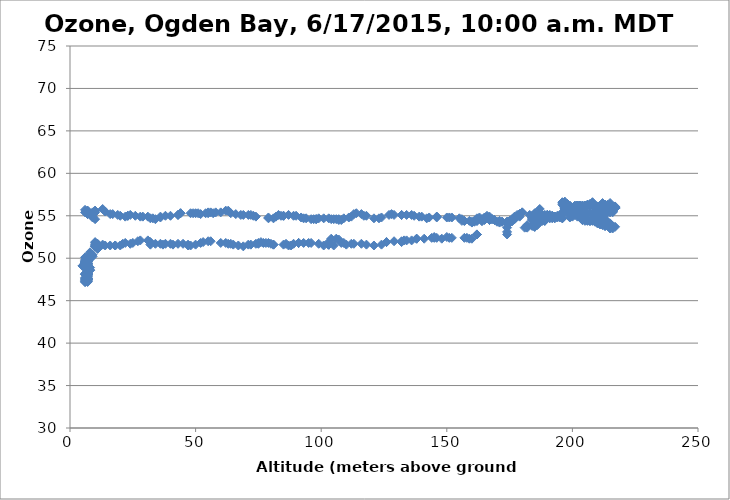
| Category | Series 0 |
|---|---|
| 6.0 | 50.1 |
| -2.0 | 50 |
| 6.0 | 49.8 |
| 6.0 | 49.5 |
| 6.0 | 49.5 |
| 6.0 | 49.3 |
| 6.0 | 49.3 |
| 6.0 | 49.3 |
| 6.0 | 49.1 |
| 6.0 | 49.1 |
| 6.0 | 49 |
| 6.0 | 49 |
| 6.0 | 49 |
| 6.0 | 49 |
| 6.0 | 49.1 |
| 6.0 | 49.1 |
| 6.0 | 49.1 |
| 6.0 | 49.2 |
| 6.0 | 49.3 |
| 6.0 | 49.4 |
| 6.0 | 49.4 |
| 6.0 | 49.4 |
| 6.0 | 49.5 |
| 6.0 | 49.6 |
| 6.0 | 49.5 |
| 6.0 | 49.5 |
| 6.0 | 49.4 |
| 6.0 | 49.2 |
| 6.0 | 49.2 |
| 6.0 | 49.2 |
| 6.0 | 49.3 |
| 6.0 | 49.3 |
| 6.0 | 49.4 |
| 6.0 | 49.4 |
| 6.0 | 49.4 |
| 6.0 | 49.4 |
| 6.0 | 49.5 |
| 6.0 | 49.6 |
| 6.0 | 49.7 |
| 7.0 | 49.7 |
| 7.0 | 49.7 |
| 7.0 | 49.8 |
| 7.0 | 49.8 |
| 7.0 | 49.6 |
| 7.0 | 49.4 |
| 7.0 | 49.2 |
| 7.0 | 49.2 |
| 7.0 | 49.3 |
| 7.0 | 49.4 |
| 7.0 | 49.4 |
| 7.0 | 49.4 |
| 7.0 | 49.4 |
| 7.0 | 49.4 |
| 7.0 | 49.3 |
| 7.0 | 49.2 |
| 7.0 | 49.1 |
| 7.0 | 49 |
| 7.0 | 49 |
| 7.0 | 48.9 |
| 7.0 | 48.9 |
| 7.0 | 48.6 |
| 7.0 | 48.5 |
| 7.0 | 48.4 |
| 7.0 | 48.2 |
| 7.0 | 48 |
| 7.0 | 47.8 |
| 7.0 | 47.6 |
| 7.0 | 47.6 |
| 7.0 | 47.6 |
| 7.0 | 47.5 |
| 7.0 | 47.5 |
| 7.0 | 47.5 |
| 7.0 | 47.5 |
| 7.0 | 47.5 |
| 7.0 | 47.6 |
| 7.0 | 47.6 |
| 7.0 | 47.6 |
| 7.0 | 47.6 |
| 7.0 | 47.5 |
| 7.0 | 47.4 |
| 7.0 | 47.3 |
| 7.0 | 47.3 |
| 7.0 | 47.4 |
| 7.0 | 47.3 |
| 7.0 | 47.3 |
| 7.0 | 47.2 |
| 6.0 | 47.2 |
| 6.0 | 47.2 |
| 6.0 | 47.3 |
| 6.0 | 47.4 |
| 6.0 | 47.5 |
| 6.0 | 47.6 |
| 6.0 | 47.7 |
| 7.0 | 47.9 |
| 7.0 | 48.1 |
| 7.0 | 48.1 |
| 7.0 | 48.2 |
| 7.0 | 48.2 |
| 7.0 | 48.1 |
| 6.0 | 48.1 |
| 6.0 | 48.2 |
| 6.0 | 48.1 |
| 7.0 | 47.8 |
| 7.0 | 47.8 |
| 7.0 | 47.7 |
| 7.0 | 47.6 |
| 7.0 | 47.9 |
| 7.0 | 48.1 |
| 7.0 | 48.1 |
| 7.0 | 48.2 |
| 7.0 | 48.5 |
| 7.0 | 48.7 |
| 7.0 | 48.8 |
| 7.0 | 48.8 |
| 7.0 | 48.9 |
| 7.0 | 49.1 |
| 7.0 | 48.9 |
| 7.0 | 48.7 |
| 7.0 | 48.8 |
| 7.0 | 49.6 |
| 7.0 | 49.3 |
| 7.0 | 49.1 |
| 7.0 | 49.5 |
| 7.0 | 49.6 |
| 7.0 | 49.6 |
| 7.0 | 49.6 |
| 7.0 | 49.3 |
| 8.0 | 48.9 |
| 8.0 | 48.6 |
| 8.0 | 48.6 |
| 7.0 | 48.6 |
| 7.0 | 48.2 |
| 7.0 | 48.1 |
| 7.0 | 48 |
| 7.0 | 48 |
| 7.0 | 48.2 |
| 7.0 | 48.3 |
| 7.0 | 48.5 |
| 7.0 | 48.6 |
| 7.0 | 48.7 |
| 7.0 | 49.1 |
| 6.0 | 49.2 |
| 6.0 | 49.2 |
| 5.0 | 49.1 |
| 5.0 | 49.1 |
| 6.0 | 49.2 |
| 6.0 | 49.3 |
| 7.0 | 49.6 |
| 7.0 | 49.6 |
| 7.0 | 49.7 |
| 8.0 | 50 |
| 8.0 | 50.5 |
| 8.0 | 50.7 |
| 9.0 | 50.2 |
| 9.0 | 50.4 |
| 11.0 | 51.1 |
| 11.0 | 51.2 |
| 11.0 | 51.3 |
| 11.0 | 51.5 |
| 11.0 | 51.5 |
| 11.0 | 51.6 |
| 10.0 | 51.4 |
| 10.0 | 51.5 |
| 10.0 | 51.4 |
| 10.0 | 51.4 |
| 10.0 | 51.8 |
| 10.0 | 51.9 |
| 10.0 | 51.6 |
| 11.0 | 51.6 |
| 11.0 | 51.7 |
| 13.0 | 51.6 |
| 14.0 | 51.5 |
| 16.0 | 51.5 |
| 18.0 | 51.5 |
| 18.0 | 51.5 |
| 20.0 | 51.5 |
| 21.0 | 51.7 |
| 22.0 | 51.8 |
| 24.0 | 51.7 |
| 25.0 | 51.8 |
| 27.0 | 52 |
| 28.0 | 52.1 |
| 31.0 | 52.1 |
| 32.0 | 51.9 |
| 32.0 | 51.6 |
| 34.0 | 51.7 |
| 36.0 | 51.7 |
| 37.0 | 51.6 |
| 38.0 | 51.7 |
| 40.0 | 51.7 |
| 41.0 | 51.6 |
| 43.0 | 51.7 |
| 45.0 | 51.7 |
| 47.0 | 51.6 |
| 47.0 | 51.5 |
| 48.0 | 51.5 |
| 50.0 | 51.6 |
| 52.0 | 51.8 |
| 53.0 | 51.9 |
| 55.0 | 52 |
| 56.0 | 52 |
| 60.0 | 51.8 |
| 62.0 | 51.8 |
| 63.0 | 51.7 |
| 64.0 | 51.7 |
| 65.0 | 51.6 |
| 67.0 | 51.5 |
| 69.0 | 51.4 |
| 71.0 | 51.6 |
| 72.0 | 51.6 |
| 74.0 | 51.7 |
| 75.0 | 51.7 |
| 75.0 | 51.8 |
| 76.0 | 51.9 |
| 77.0 | 51.8 |
| 78.0 | 51.8 |
| 79.0 | 51.8 |
| 80.0 | 51.7 |
| 81.0 | 51.6 |
| 81.0 | 51.6 |
| 85.0 | 51.6 |
| 86.0 | 51.7 |
| 87.0 | 51.5 |
| 88.0 | 51.5 |
| 89.0 | 51.7 |
| 91.0 | 51.8 |
| 91.0 | 51.8 |
| 91.0 | 51.8 |
| 93.0 | 51.8 |
| 95.0 | 51.8 |
| 96.0 | 51.8 |
| 99.0 | 51.7 |
| 101.0 | 51.5 |
| 103.0 | 51.6 |
| 103.0 | 51.6 |
| 103.0 | 51.6 |
| 103.0 | 51.6 |
| 103.0 | 51.6 |
| 103.0 | 51.9 |
| 104.0 | 52.3 |
| 105.0 | 51.5 |
| 106.0 | 52.3 |
| 107.0 | 52.2 |
| 108.0 | 51.8 |
| 109.0 | 51.8 |
| 110.0 | 51.6 |
| 112.0 | 51.7 |
| 113.0 | 51.7 |
| 116.0 | 51.7 |
| 118.0 | 51.6 |
| 121.0 | 51.5 |
| 124.0 | 51.6 |
| 126.0 | 51.9 |
| 126.0 | 51.9 |
| 129.0 | 52 |
| 132.0 | 51.9 |
| 132.0 | 52 |
| 133.0 | 52.1 |
| 134.0 | 52.1 |
| 136.0 | 52.1 |
| 138.0 | 52.3 |
| 138.0 | 52.3 |
| 141.0 | 52.3 |
| 144.0 | 52.4 |
| 145.0 | 52.5 |
| 145.0 | 52.4 |
| 146.0 | 52.4 |
| 148.0 | 52.3 |
| 150.0 | 52.5 |
| 151.0 | 52.4 |
| 152.0 | 52.4 |
| 157.0 | 52.4 |
| 158.0 | 52.4 |
| 159.0 | 52.3 |
| 160.0 | 52.3 |
| 162.0 | 52.8 |
| 162.0 | 52.8 |
| 162.0 | 52.8 |
| 174.0 | 52.8 |
| 174.0 | 53.1 |
| 174.0 | 53.6 |
| 181.0 | 53.6 |
| 182.0 | 53.6 |
| 182.0 | 53.9 |
| 184.0 | 53.9 |
| 184.0 | 53.8 |
| 185.0 | 53.9 |
| 185.0 | 53.8 |
| 185.0 | 53.8 |
| 185.0 | 53.8 |
| 185.0 | 53.7 |
| 185.0 | 53.7 |
| 186.0 | 53.9 |
| 185.0 | 54 |
| 185.0 | 54.5 |
| 189.0 | 54.4 |
| 189.0 | 54.4 |
| 189.0 | 54.5 |
| 189.0 | 54.9 |
| 187.0 | 55.8 |
| 185.0 | 55.3 |
| 185.0 | 55.2 |
| 185.0 | 55.2 |
| 185.0 | 55.2 |
| 185.0 | 55.2 |
| 185.0 | 55.2 |
| 185.0 | 55.2 |
| 185.0 | 55.2 |
| 185.0 | 55.1 |
| 185.0 | 55 |
| 185.0 | 55 |
| 185.0 | 54.7 |
| 184.0 | 54.6 |
| 184.0 | 54.5 |
| 184.0 | 54.5 |
| 184.0 | 54.7 |
| 184.0 | 54.8 |
| 184.0 | 54.8 |
| 185.0 | 54.9 |
| 185.0 | 55 |
| 185.0 | 55.2 |
| 186.0 | 55.2 |
| 186.0 | 54.6 |
| 187.0 | 54.4 |
| 188.0 | 54.4 |
| 188.0 | 54.5 |
| 189.0 | 54.6 |
| 191.0 | 54.7 |
| 192.0 | 54.8 |
| 192.0 | 54.7 |
| 193.0 | 54.7 |
| 194.0 | 54.8 |
| 195.0 | 54.8 |
| 196.0 | 54.7 |
| 196.0 | 54.7 |
| 199.0 | 54.8 |
| 200.0 | 54.9 |
| 202.0 | 54.9 |
| 203.0 | 55 |
| 203.0 | 55.2 |
| 204.0 | 55.3 |
| 204.0 | 55.3 |
| 206.0 | 55.3 |
| 207.0 | 55.3 |
| 208.0 | 55.2 |
| 209.0 | 55.1 |
| 210.0 | 55.2 |
| 211.0 | 55.3 |
| 212.0 | 55.3 |
| 212.0 | 55.4 |
| 213.0 | 55.4 |
| 213.0 | 55.4 |
| 214.0 | 55.4 |
| 214.0 | 55.4 |
| 215.0 | 55.4 |
| 215.0 | 55.5 |
| 215.0 | 55.5 |
| 216.0 | 55.4 |
| 216.0 | 55.5 |
| 216.0 | 55.5 |
| 216.0 | 55.5 |
| 216.0 | 55.6 |
| 216.0 | 55.6 |
| 216.0 | 55.8 |
| 217.0 | 55.9 |
| 217.0 | 55.9 |
| 217.0 | 55.9 |
| 217.0 | 55.9 |
| 217.0 | 56 |
| 217.0 | 56 |
| 217.0 | 56.1 |
| 217.0 | 56 |
| 216.0 | 56 |
| 216.0 | 56 |
| 216.0 | 56.1 |
| 215.0 | 56.2 |
| 215.0 | 56.2 |
| 215.0 | 56.2 |
| 215.0 | 56.2 |
| 215.0 | 56.3 |
| 215.0 | 56.5 |
| 215.0 | 56.3 |
| 214.0 | 56.3 |
| 214.0 | 56.2 |
| 214.0 | 56.2 |
| 213.0 | 56.2 |
| 213.0 | 56.3 |
| 213.0 | 56.3 |
| 212.0 | 56.2 |
| 212.0 | 56.3 |
| 212.0 | 56.2 |
| 212.0 | 56.4 |
| 212.0 | 56.5 |
| 212.0 | 56.4 |
| 212.0 | 56.3 |
| 212.0 | 56.2 |
| 211.0 | 56.2 |
| 211.0 | 56.2 |
| 211.0 | 56.2 |
| 211.0 | 56.2 |
| 211.0 | 56.2 |
| 211.0 | 56.2 |
| 211.0 | 56.2 |
| 211.0 | 56.2 |
| 211.0 | 56.1 |
| 211.0 | 56 |
| 211.0 | 55.9 |
| 210.0 | 55.9 |
| 210.0 | 56.1 |
| 210.0 | 56.1 |
| 210.0 | 56 |
| 210.0 | 56 |
| 210.0 | 55.9 |
| 209.0 | 55.9 |
| 209.0 | 55.9 |
| 209.0 | 56 |
| 209.0 | 56.1 |
| 209.0 | 56.1 |
| 209.0 | 56.2 |
| 209.0 | 56.2 |
| 208.0 | 56.4 |
| 208.0 | 56.5 |
| 208.0 | 56.6 |
| 208.0 | 56.5 |
| 207.0 | 56.4 |
| 207.0 | 56.3 |
| 207.0 | 56.2 |
| 207.0 | 56.2 |
| 207.0 | 56.2 |
| 206.0 | 56.2 |
| 207.0 | 56.2 |
| 206.0 | 56.3 |
| 206.0 | 56.3 |
| 205.0 | 56.2 |
| 205.0 | 56.2 |
| 205.0 | 56.1 |
| 205.0 | 56.1 |
| 204.0 | 56.1 |
| 204.0 | 56.2 |
| 204.0 | 56.2 |
| 204.0 | 56.1 |
| 204.0 | 56.1 |
| 203.0 | 56.2 |
| 203.0 | 56.2 |
| 203.0 | 56.2 |
| 203.0 | 56.2 |
| 203.0 | 56.2 |
| 203.0 | 56 |
| 203.0 | 56.1 |
| 203.0 | 56.1 |
| 203.0 | 56.2 |
| 203.0 | 56.2 |
| 203.0 | 56.2 |
| 203.0 | 56.1 |
| 203.0 | 56.2 |
| 203.0 | 56.2 |
| 202.0 | 56.2 |
| 202.0 | 56.1 |
| 202.0 | 56 |
| 202.0 | 55.9 |
| 202.0 | 56 |
| 202.0 | 56.2 |
| 202.0 | 56.2 |
| 202.0 | 56.2 |
| 202.0 | 56.2 |
| 202.0 | 56.2 |
| 201.0 | 56.2 |
| 201.0 | 56.1 |
| 201.0 | 56.1 |
| 201.0 | 56.1 |
| 201.0 | 56.1 |
| 201.0 | 55.9 |
| 200.0 | 55.9 |
| 200.0 | 55.9 |
| 200.0 | 55.9 |
| 200.0 | 55.9 |
| 200.0 | 55.8 |
| 200.0 | 55.8 |
| 200.0 | 55.8 |
| 199.0 | 55.8 |
| 199.0 | 55.8 |
| 199.0 | 55.8 |
| 199.0 | 55.6 |
| 199.0 | 55.5 |
| 199.0 | 55.5 |
| 199.0 | 55.4 |
| 199.0 | 55.4 |
| 199.0 | 55.4 |
| 199.0 | 55.6 |
| 199.0 | 55.6 |
| 199.0 | 55.5 |
| 198.0 | 55.5 |
| 198.0 | 55.5 |
| 198.0 | 55.7 |
| 198.0 | 55.7 |
| 198.0 | 55.8 |
| 198.0 | 55.8 |
| 198.0 | 55.8 |
| 198.0 | 55.8 |
| 198.0 | 55.8 |
| 198.0 | 55.8 |
| 198.0 | 55.8 |
| 198.0 | 55.8 |
| 198.0 | 55.8 |
| 198.0 | 55.8 |
| 197.0 | 55.8 |
| 197.0 | 55.8 |
| 197.0 | 55.8 |
| 197.0 | 55.9 |
| 197.0 | 56 |
| 197.0 | 56 |
| 197.0 | 56.1 |
| 198.0 | 56.1 |
| 198.0 | 56.2 |
| 198.0 | 56.2 |
| 198.0 | 56.2 |
| 198.0 | 56.1 |
| 198.0 | 56.1 |
| 198.0 | 56.1 |
| 198.0 | 56.1 |
| 198.0 | 56.1 |
| 197.0 | 56.1 |
| 197.0 | 56 |
| 197.0 | 55.9 |
| 197.0 | 55.9 |
| 197.0 | 55.8 |
| 197.0 | 55.8 |
| 197.0 | 55.9 |
| 197.0 | 56.1 |
| 197.0 | 56.1 |
| 196.0 | 56.3 |
| 196.0 | 56.5 |
| 196.0 | 56.6 |
| 197.0 | 56.6 |
| 197.0 | 56.6 |
| 197.0 | 56.6 |
| 197.0 | 56.6 |
| 197.0 | 56.6 |
| 197.0 | 56.5 |
| 197.0 | 56.6 |
| 197.0 | 56.5 |
| 198.0 | 56.4 |
| 198.0 | 56.3 |
| 198.0 | 56.2 |
| 198.0 | 56.2 |
| 198.0 | 56.2 |
| 198.0 | 56.2 |
| 199.0 | 56.2 |
| 199.0 | 56 |
| 199.0 | 55.9 |
| 199.0 | 55.9 |
| 199.0 | 55.9 |
| 199.0 | 55.9 |
| 199.0 | 55.7 |
| 200.0 | 55.5 |
| 200.0 | 55.4 |
| 201.0 | 55.3 |
| 201.0 | 55.2 |
| 201.0 | 55.1 |
| 202.0 | 55.1 |
| 202.0 | 55.1 |
| 204.0 | 54.7 |
| 204.0 | 54.5 |
| 204.0 | 54.5 |
| 205.0 | 54.5 |
| 205.0 | 54.4 |
| 206.0 | 54.4 |
| 207.0 | 54.4 |
| 207.0 | 54.4 |
| 208.0 | 54.6 |
| 208.0 | 54.6 |
| 209.0 | 54.5 |
| 209.0 | 54.4 |
| 209.0 | 54.4 |
| 210.0 | 54.2 |
| 210.0 | 54.1 |
| 211.0 | 54 |
| 211.0 | 54 |
| 212.0 | 53.9 |
| 213.0 | 53.9 |
| 213.0 | 53.8 |
| 213.0 | 53.8 |
| 214.0 | 53.8 |
| 214.0 | 53.8 |
| 215.0 | 53.6 |
| 215.0 | 53.5 |
| 216.0 | 53.5 |
| 217.0 | 53.7 |
| 216.0 | 53.8 |
| 215.0 | 54 |
| 215.0 | 54 |
| 215.0 | 54 |
| 215.0 | 54 |
| 215.0 | 54.1 |
| 214.0 | 54.1 |
| 214.0 | 54.1 |
| 214.0 | 54.1 |
| 214.0 | 54.2 |
| 214.0 | 54.3 |
| 213.0 | 54.3 |
| 213.0 | 54.3 |
| 213.0 | 54.4 |
| 212.0 | 54.4 |
| 212.0 | 54.4 |
| 212.0 | 54.4 |
| 212.0 | 54.4 |
| 211.0 | 54.3 |
| 211.0 | 54.3 |
| 211.0 | 54.4 |
| 211.0 | 54.4 |
| 211.0 | 54.5 |
| 211.0 | 54.5 |
| 211.0 | 54.4 |
| 211.0 | 54.4 |
| 212.0 | 54.5 |
| 212.0 | 54.5 |
| 212.0 | 54.5 |
| 212.0 | 54.5 |
| 212.0 | 54.4 |
| 212.0 | 54.4 |
| 212.0 | 54.4 |
| 212.0 | 54.4 |
| 212.0 | 54.3 |
| 212.0 | 54.3 |
| 213.0 | 54.3 |
| 213.0 | 54.3 |
| 213.0 | 54.4 |
| 212.0 | 54.5 |
| 212.0 | 54.6 |
| 212.0 | 54.5 |
| 213.0 | 54.5 |
| 213.0 | 54.6 |
| 212.0 | 54.7 |
| 212.0 | 54.7 |
| 212.0 | 54.8 |
| 212.0 | 54.8 |
| 212.0 | 54.7 |
| 211.0 | 54.6 |
| 211.0 | 54.5 |
| 211.0 | 54.5 |
| 211.0 | 54.6 |
| 211.0 | 54.5 |
| 211.0 | 54.5 |
| 211.0 | 54.7 |
| 211.0 | 54.7 |
| 211.0 | 54.8 |
| 211.0 | 54.8 |
| 210.0 | 54.8 |
| 211.0 | 54.6 |
| 211.0 | 54.6 |
| 211.0 | 54.6 |
| 211.0 | 54.6 |
| 211.0 | 54.5 |
| 211.0 | 54.5 |
| 211.0 | 54.5 |
| 211.0 | 54.4 |
| 211.0 | 54.4 |
| 211.0 | 54.5 |
| 212.0 | 54.6 |
| 212.0 | 54.7 |
| 212.0 | 54.6 |
| 212.0 | 54.5 |
| 212.0 | 54.5 |
| 212.0 | 54.5 |
| 212.0 | 54.5 |
| 211.0 | 54.5 |
| 211.0 | 54.5 |
| 211.0 | 54.5 |
| 211.0 | 54.5 |
| 211.0 | 54.5 |
| 211.0 | 54.3 |
| 211.0 | 54.3 |
| 211.0 | 54.3 |
| 210.0 | 54.3 |
| 209.0 | 54.3 |
| 209.0 | 54.4 |
| 209.0 | 54.4 |
| 208.0 | 54.4 |
| 207.0 | 54.4 |
| 206.0 | 54.5 |
| 206.0 | 54.5 |
| 205.0 | 54.7 |
| 204.0 | 54.7 |
| 204.0 | 54.8 |
| 203.0 | 55 |
| 202.0 | 55.1 |
| 202.0 | 55.2 |
| 201.0 | 55.2 |
| 200.0 | 55.3 |
| 199.0 | 55.4 |
| 199.0 | 55.4 |
| 198.0 | 55.4 |
| 197.0 | 55.4 |
| 196.0 | 55.4 |
| 196.0 | 55.3 |
| 194.0 | 55 |
| 193.0 | 54.9 |
| 193.0 | 54.9 |
| 193.0 | 54.9 |
| 192.0 | 55 |
| 192.0 | 55 |
| 191.0 | 55.1 |
| 190.0 | 55.1 |
| 190.0 | 55.1 |
| 189.0 | 55.1 |
| 188.0 | 55.1 |
| 187.0 | 55.1 |
| 186.0 | 54.9 |
| 185.0 | 54.9 |
| 185.0 | 55 |
| 184.0 | 55 |
| 183.0 | 55.1 |
| 180.0 | 55.4 |
| 180.0 | 55.4 |
| 179.0 | 55.2 |
| 179.0 | 54.9 |
| 179.0 | 55.2 |
| 178.0 | 55.1 |
| 177.0 | 54.9 |
| 177.0 | 54.6 |
| 177.0 | 54.7 |
| 176.0 | 54.6 |
| 176.0 | 54.4 |
| 176.0 | 54.4 |
| 176.0 | 54.5 |
| 176.0 | 54.4 |
| 175.0 | 54.2 |
| 175.0 | 54.3 |
| 175.0 | 54.2 |
| 176.0 | 54.4 |
| 175.0 | 54.2 |
| 175.0 | 54.2 |
| 175.0 | 54.4 |
| 175.0 | 54.4 |
| 174.0 | 54.3 |
| 174.0 | 54.1 |
| 174.0 | 54.3 |
| 172.0 | 54.3 |
| 172.0 | 54.3 |
| 171.0 | 54.2 |
| 171.0 | 54.4 |
| 170.0 | 54.3 |
| 169.0 | 54.5 |
| 169.0 | 54.5 |
| 168.0 | 54.6 |
| 168.0 | 54.6 |
| 167.0 | 54.7 |
| 167.0 | 54.5 |
| 167.0 | 54.5 |
| 167.0 | 54.6 |
| 167.0 | 54.9 |
| 166.0 | 54.8 |
| 166.0 | 54.8 |
| 166.0 | 55 |
| 165.0 | 54.8 |
| 165.0 | 54.6 |
| 165.0 | 54.6 |
| 165.0 | 54.5 |
| 164.0 | 54.4 |
| 164.0 | 54.4 |
| 164.0 | 54.4 |
| 164.0 | 54.5 |
| 164.0 | 54.6 |
| 163.0 | 54.8 |
| 162.0 | 54.7 |
| 162.0 | 54.4 |
| 162.0 | 54.4 |
| 161.0 | 54.4 |
| 161.0 | 54.4 |
| 161.0 | 54.3 |
| 160.0 | 54.3 |
| 160.0 | 54.2 |
| 159.0 | 54.4 |
| 157.0 | 54.4 |
| 157.0 | 54.4 |
| 156.0 | 54.4 |
| 156.0 | 54.6 |
| 155.0 | 54.7 |
| 152.0 | 54.8 |
| 151.0 | 54.8 |
| 150.0 | 54.8 |
| 146.0 | 54.9 |
| 146.0 | 54.9 |
| 146.0 | 54.8 |
| 143.0 | 54.8 |
| 142.0 | 54.7 |
| 140.0 | 54.9 |
| 139.0 | 54.9 |
| 137.0 | 55 |
| 136.0 | 55.1 |
| 134.0 | 55.1 |
| 132.0 | 55.1 |
| 132.0 | 55.1 |
| 129.0 | 55.1 |
| 128.0 | 55.2 |
| 127.0 | 55.1 |
| 124.0 | 54.8 |
| 123.0 | 54.7 |
| 121.0 | 54.7 |
| 118.0 | 55 |
| 117.0 | 55 |
| 116.0 | 55.2 |
| 114.0 | 55.3 |
| 113.0 | 55.2 |
| 112.0 | 54.9 |
| 111.0 | 54.8 |
| 109.0 | 54.7 |
| 108.0 | 54.5 |
| 107.0 | 54.5 |
| 107.0 | 54.6 |
| 106.0 | 54.6 |
| 105.0 | 54.6 |
| 104.0 | 54.6 |
| 103.0 | 54.7 |
| 101.0 | 54.7 |
| 99.0 | 54.7 |
| 98.0 | 54.6 |
| 98.0 | 54.6 |
| 97.0 | 54.6 |
| 96.0 | 54.6 |
| 94.0 | 54.7 |
| 93.0 | 54.7 |
| 92.0 | 54.8 |
| 90.0 | 55 |
| 89.0 | 55 |
| 87.0 | 55.1 |
| 85.0 | 55 |
| 85.0 | 55 |
| 84.0 | 55 |
| 83.0 | 55.1 |
| 82.0 | 54.9 |
| 81.0 | 54.7 |
| 79.0 | 54.7 |
| 79.0 | 54.8 |
| 74.0 | 54.9 |
| 73.0 | 55 |
| 72.0 | 55.1 |
| 71.0 | 55.1 |
| 69.0 | 55.1 |
| 68.0 | 55.1 |
| 66.0 | 55.2 |
| 64.0 | 55.3 |
| 63.0 | 55.6 |
| 62.0 | 55.6 |
| 60.0 | 55.4 |
| 58.0 | 55.4 |
| 57.0 | 55.3 |
| 56.0 | 55.4 |
| 55.0 | 55.4 |
| 55.0 | 55.3 |
| 54.0 | 55.3 |
| 52.0 | 55.2 |
| 51.0 | 55.3 |
| 50.0 | 55.3 |
| 49.0 | 55.3 |
| 48.0 | 55.3 |
| 44.0 | 55.3 |
| 44.0 | 55.3 |
| 43.0 | 55.1 |
| 43.0 | 55.1 |
| 40.0 | 55 |
| 38.0 | 55 |
| 36.0 | 54.9 |
| 36.0 | 54.8 |
| 34.0 | 54.6 |
| 33.0 | 54.7 |
| 32.0 | 54.7 |
| 31.0 | 54.9 |
| 29.0 | 54.9 |
| 28.0 | 54.9 |
| 26.0 | 55 |
| 24.0 | 55.1 |
| 23.0 | 55 |
| 23.0 | 55 |
| 22.0 | 54.9 |
| 20.0 | 55 |
| 19.0 | 55.1 |
| 17.0 | 55.2 |
| 16.0 | 55.2 |
| 14.0 | 55.5 |
| 13.0 | 55.8 |
| 10.0 | 55.6 |
| 10.0 | 55.6 |
| 10.0 | 55.4 |
| 10.0 | 54.6 |
| 9.0 | 54.8 |
| 9.0 | 54.9 |
| 9.0 | 55.4 |
| 7.0 | 55.6 |
| 6.0 | 55.4 |
| 6.0 | 55.7 |
| 7.0 | 55.6 |
| 7.0 | 55.5 |
| 7.0 | 55.3 |
| 7.0 | 55.5 |
| 7.0 | 55.4 |
| 7.0 | 55.4 |
| 7.0 | 55.2 |
| 7.0 | 55.2 |